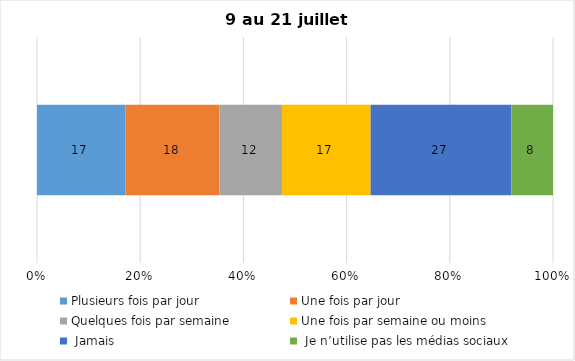
| Category | Plusieurs fois par jour | Une fois par jour | Quelques fois par semaine   | Une fois par semaine ou moins   |  Jamais   |  Je n’utilise pas les médias sociaux |
|---|---|---|---|---|---|---|
| 0 | 17 | 18 | 12 | 17 | 27 | 8 |